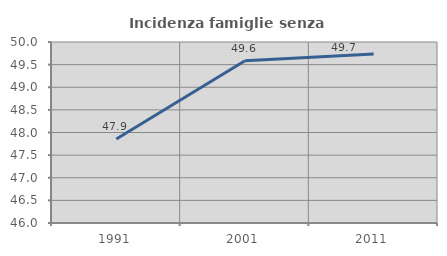
| Category | Incidenza famiglie senza nuclei |
|---|---|
| 1991.0 | 47.857 |
| 2001.0 | 49.587 |
| 2011.0 | 49.733 |